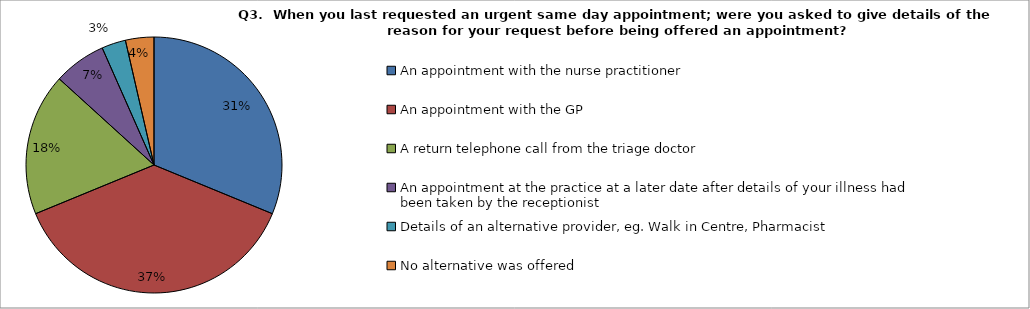
| Category | Series 0 |
|---|---|
| An appointment with the nurse practitioner | 113 |
| An appointment with the GP | 136 |
| A return telephone call from the triage doctor | 65 |
| An appointment at the practice at a later date after details of your illness had been taken by the receptionist | 24 |
| Details of an alternative provider, eg. Walk in Centre, Pharmacist | 11 |
| No alternative was offered | 13 |